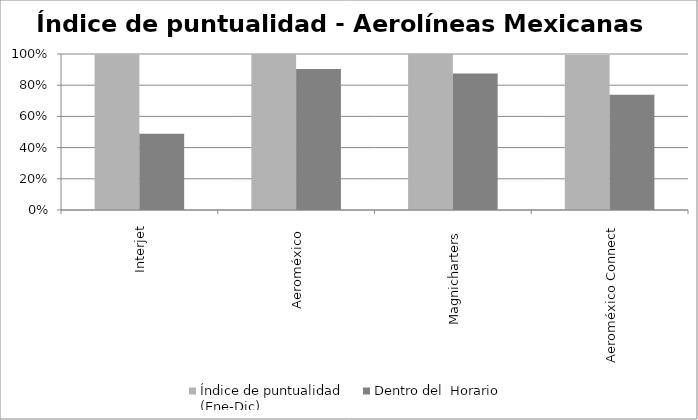
| Category | Índice de puntualidad
(Ene-Dic) | Dentro del  Horario |
|---|---|---|
| Interjet | 0.997 | 0.489 |
| Aeroméxico  | 1 | 0.904 |
| Magnicharters  | 1 | 0.875 |
| Aeroméxico Connect | 0.993 | 0.739 |